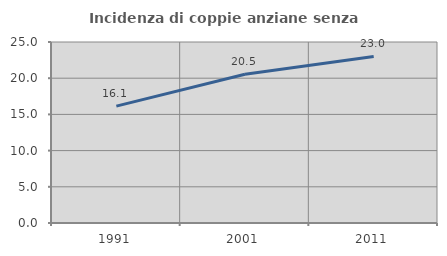
| Category | Incidenza di coppie anziane senza figli  |
|---|---|
| 1991.0 | 16.143 |
| 2001.0 | 20.544 |
| 2011.0 | 23.002 |